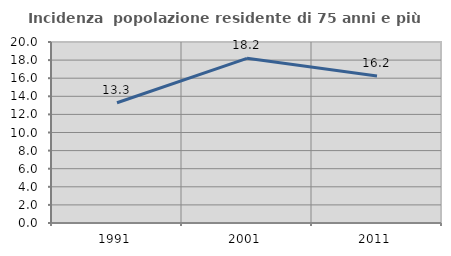
| Category | Incidenza  popolazione residente di 75 anni e più |
|---|---|
| 1991.0 | 13.288 |
| 2001.0 | 18.197 |
| 2011.0 | 16.24 |